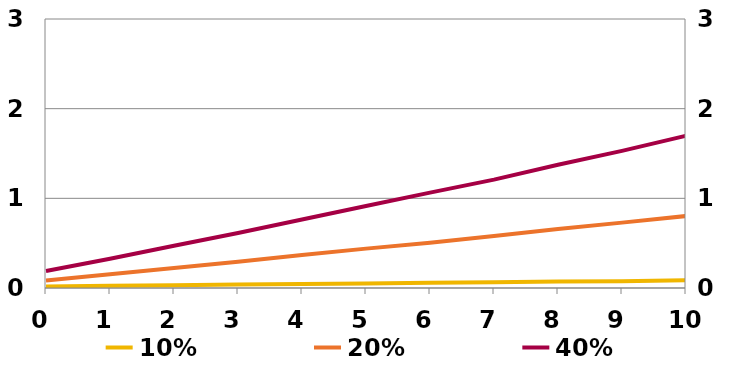
| Category | 10% | 20% |
|---|---|---|
| 0.0 | 0.018 | 0.083 |
| 1.0 | 0.025 | 0.153 |
| 2.0 | 0.03 | 0.222 |
| 3.0 | 0.038 | 0.294 |
| 4.0 | 0.045 | 0.368 |
| 5.0 | 0.05 | 0.439 |
| 6.0 | 0.06 | 0.505 |
| 7.0 | 0.065 | 0.58 |
| 8.0 | 0.071 | 0.659 |
| 9.0 | 0.077 | 0.729 |
| 10.0 | 0.086 | 0.803 |